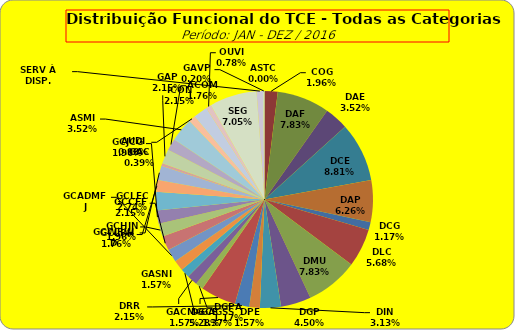
| Category | ASTC |
|---|---|
| ASTC | 0 |
| COG | 10 |
| DAF | 40 |
| DAE | 18 |
| DCE | 45 |
| DAP | 32 |
| DCG | 6 |
| DLC | 29 |
| DMU | 40 |
| DGP | 23 |
| DIN | 16 |
| DPE | 8 |
| DRR | 11 |
| DGCE | 27 |
| DGPA | 6 |
| GACMG | 8 |
| GAGSS | 7 |
| GASNI | 8 |
| GCADMFJ | 10 |
| GCCFF | 11 |
| GCHJN | 10 |
| GCJCG | 10 |
| GCLEC | 14 |
| GCLRH | 9 |
| GCWRWD | 11 |
| GAC | 2 |
| GAP | 11 |
| ACOM | 9 |
| ASMI | 18 |
| AUDI | 5 |
| ICON | 11 |
| OUVI | 4 |
| SEG | 36 |
| SERV À DISP. | 5 |
| GAVP | 1 |